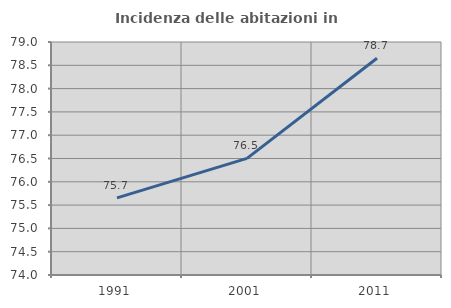
| Category | Incidenza delle abitazioni in proprietà  |
|---|---|
| 1991.0 | 75.654 |
| 2001.0 | 76.503 |
| 2011.0 | 78.651 |